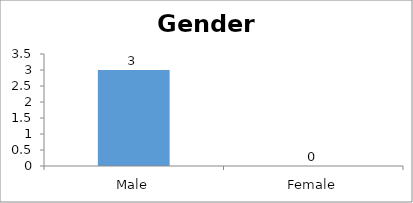
| Category | Gender |
|---|---|
| Male | 3 |
| Female | 0 |